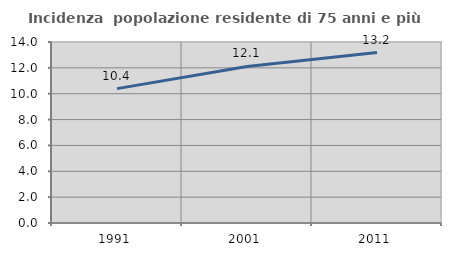
| Category | Incidenza  popolazione residente di 75 anni e più |
|---|---|
| 1991.0 | 10.393 |
| 2001.0 | 12.112 |
| 2011.0 | 13.184 |